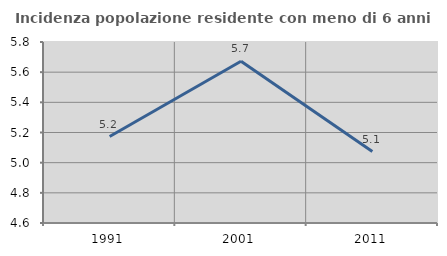
| Category | Incidenza popolazione residente con meno di 6 anni |
|---|---|
| 1991.0 | 5.173 |
| 2001.0 | 5.672 |
| 2011.0 | 5.074 |